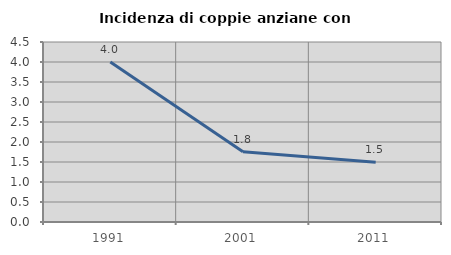
| Category | Incidenza di coppie anziane con figli |
|---|---|
| 1991.0 | 4 |
| 2001.0 | 1.754 |
| 2011.0 | 1.493 |